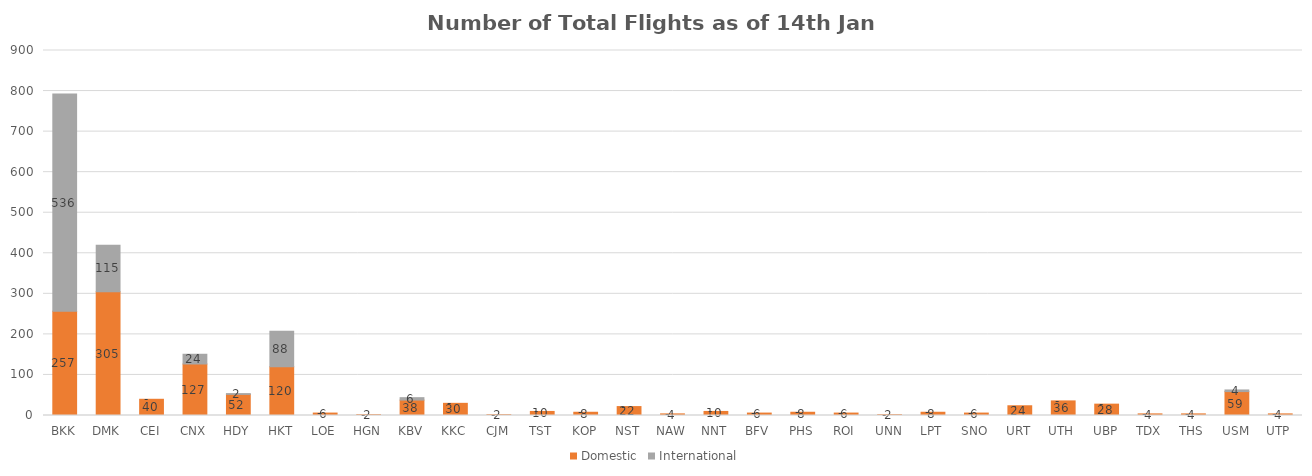
| Category | Domestic | International |
|---|---|---|
| BKK | 257 | 536 |
| DMK | 305 | 115 |
| CEI | 40 | 0 |
| CNX | 127 | 24 |
| HDY | 52 | 2 |
| HKT | 120 | 88 |
| LOE | 6 | 0 |
| HGN | 2 | 0 |
| KBV | 38 | 6 |
| KKC | 30 | 0 |
| CJM | 2 | 0 |
| TST | 10 | 0 |
| KOP | 8 | 0 |
| NST | 22 | 0 |
| NAW | 4 | 0 |
| NNT | 10 | 0 |
| BFV | 6 | 0 |
| PHS | 8 | 0 |
| ROI | 6 | 0 |
| UNN | 2 | 0 |
| LPT | 8 | 0 |
| SNO | 6 | 0 |
| URT | 24 | 0 |
| UTH | 36 | 0 |
| UBP | 28 | 0 |
| TDX | 4 | 0 |
| THS | 4 | 0 |
| USM | 59 | 4 |
| UTP | 4 | 0 |